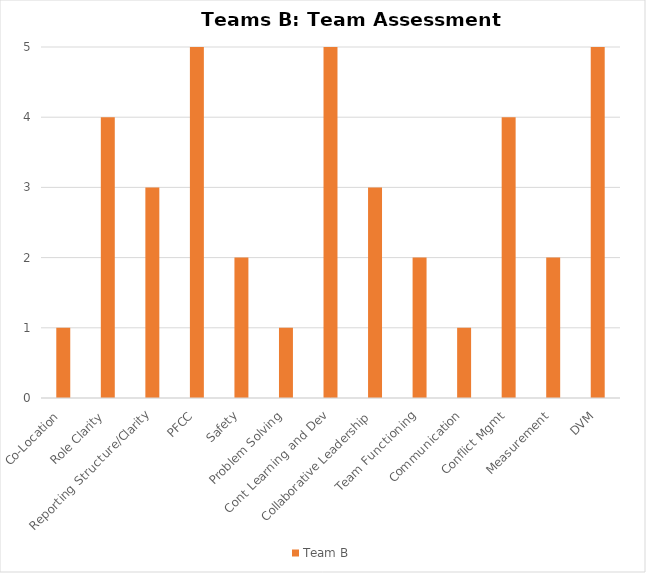
| Category | Team B |
|---|---|
| Co-Location | 1 |
| Role Clarity | 4 |
| Reporting Structure/Clarity | 3 |
| PFCC | 5 |
| Safety | 2 |
| Problem Solving | 1 |
| Cont Learning and Dev | 5 |
| Collaborative Leadership | 3 |
| Team Functioning | 2 |
| Communication | 1 |
| Conflict Mgmt | 4 |
| Measurement | 2 |
| DVM | 5 |